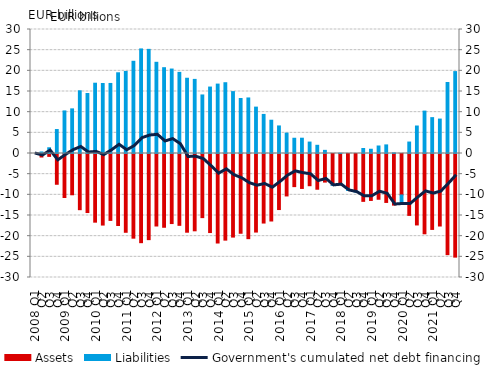
| Category | Assets | Liabilities |
|---|---|---|
| 2008 Q1 | 0 | 0 |
| Q2 | -0.851 | 0.372 |
| Q3 | -0.698 | 1.388 |
| Q4 | -7.444 | 5.798 |
| 2009 Q1 | -10.651 | 10.301 |
| Q2 | -9.986 | 10.798 |
| Q3 | -13.594 | 15.17 |
| Q4 | -14.283 | 14.52 |
| 2010 Q1 | -16.613 | 17.005 |
| Q2 | -17.314 | 16.929 |
| Q3 | -16.185 | 16.948 |
| Q4 | -17.416 | 19.527 |
| 2011 Q1 | -19.061 | 19.849 |
| Q2 | -20.485 | 22.309 |
| Q3 | -21.575 | 25.301 |
| Q4 | -20.841 | 25.195 |
| 2012 Q1 | -17.539 | 22.066 |
| Q2 | -17.847 | 20.761 |
| Q3 | -16.951 | 20.433 |
| Q4 | -17.379 | 19.629 |
| 2013 Q1 | -19.043 | 18.207 |
| Q2 | -18.703 | 17.929 |
| Q3 | -15.515 | 14.165 |
| Q4 | -19.124 | 16.074 |
| 2014 Q1 | -21.656 | 16.791 |
| Q2 | -20.959 | 17.124 |
| Q3 | -20.221 | 14.972 |
| Q4 | -19.295 | 13.303 |
| 2015 Q1 | -20.605 | 13.44 |
| Q2 | -19.008 | 11.22 |
| Q3 | -16.826 | 9.454 |
| Q4 | -16.33 | 8.051 |
| 2016 Q1 | -13.559 | 6.668 |
| Q2 | -10.267 | 4.929 |
| Q3 | -8.014 | 3.69 |
| Q4 | -8.453 | 3.701 |
| 2017 Q1 | -7.794 | 2.764 |
| Q2 | -8.643 | 1.985 |
| Q3 | -6.917 | 0.76 |
| Q4 | -7.651 | -0.06 |
| 2018 Q1 | -7.579 | 0.052 |
| Q2 | -8.44 | -0.488 |
| Q3 | -8.984 | -0.342 |
| Q4 | -11.578 | 1.207 |
| 2019 Q1 | -11.357 | 1.031 |
| Q2 | -11.069 | 1.815 |
| Q3 | -11.839 | 2.081 |
| Q4 | -12.488 | 0.146 |
| 2020 Q1 | -10.036 | -2.177 |
| Q2 | -14.977 | 2.772 |
| Q3 | -17.286 | 6.651 |
| Q4 | -19.426 | 10.257 |
| 2021 Q1 | -18.368 | 8.678 |
| Q2 | -17.543 | 8.329 |
| Q3 | -24.47 | 17.175 |
| Q4 | -25.073 | 19.815 |